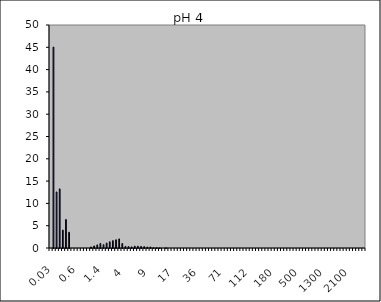
| Category | Magnetite pH 3 1 |
|---|---|
| 0.03 | 0 |
| 0.04 | 45.043 |
| 0.07 | 12.564 |
| 0.1 | 13.255 |
| 0.2 | 4.016 |
| 0.3 | 6.398 |
| 0.4 | 3.532 |
| 0.5 | 0 |
| 0.6 | 0 |
| 0.7 | 0 |
| 0.8 | 0 |
| 0.9 | 0 |
| 1.0 | 0 |
| 1.1 | 0.24 |
| 1.2 | 0.451 |
| 1.3 | 0.694 |
| 1.4 | 1.014 |
| 1.6 | 0.734 |
| 1.8 | 1.11 |
| 2.0 | 1.395 |
| 2.2 | 1.645 |
| 2.4 | 1.84 |
| 2.6 | 2.041 |
| 3.0 | 1.005 |
| 4.0 | 0.352 |
| 5.0 | 0.322 |
| 6.0 | 0.251 |
| 6.5 | 0.408 |
| 7.0 | 0.397 |
| 7.5 | 0.332 |
| 8.0 | 0.304 |
| 8.5 | 0.216 |
| 9.0 | 0.229 |
| 10.0 | 0.062 |
| 11.0 | 0.069 |
| 12.0 | 0.038 |
| 13.0 | 0 |
| 14.0 | 0.044 |
| 15.0 | 0 |
| 16.0 | 0 |
| 17.0 | 0 |
| 18.0 | 0 |
| 19.0 | 0 |
| 20.0 | 0 |
| 22.0 | 0 |
| 25.0 | 0 |
| 28.0 | 0 |
| 32.0 | 0 |
| 36.0 | 0 |
| 38.0 | 0 |
| 40.0 | 0 |
| 45.0 | 0 |
| 50.0 | 0 |
| 53.0 | 0 |
| 56.0 | 0 |
| 63.0 | 0 |
| 71.0 | 0 |
| 75.0 | 0 |
| 80.0 | 0 |
| 85.0 | 0 |
| 90.0 | 0 |
| 95.0 | 0 |
| 100.0 | 0 |
| 106.0 | 0 |
| 112.0 | 0 |
| 125.0 | 0 |
| 130.0 | 0 |
| 140.0 | 0 |
| 145.0 | 0 |
| 150.0 | 0 |
| 160.0 | 0 |
| 170.0 | 0 |
| 180.0 | 0 |
| 190.0 | 0 |
| 200.0 | 0 |
| 212.0 | 0 |
| 242.0 | 0 |
| 250.0 | 0 |
| 300.0 | 0 |
| 400.0 | 0 |
| 500.0 | 0 |
| 600.0 | 0 |
| 700.0 | 0 |
| 800.0 | 0 |
| 900.0 | 0 |
| 1000.0 | 0 |
| 1100.0 | 0 |
| 1200.0 | 0 |
| 1300.0 | 0 |
| 1400.0 | 0 |
| 1500.0 | 0 |
| 1600.0 | 0 |
| 1700.0 | 0 |
| 1800.0 | 0 |
| 1900.0 | 0 |
| 2000.0 | 0 |
| 2100.0 | 0 |
| 2200.0 | 0 |
| 2300.0 | 0 |
| 2400.0 | 0 |
| 2500.0 | 0 |